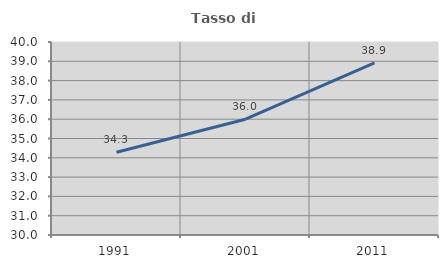
| Category | Tasso di occupazione   |
|---|---|
| 1991.0 | 34.288 |
| 2001.0 | 36 |
| 2011.0 | 38.915 |